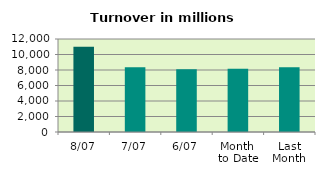
| Category | Series 0 |
|---|---|
| 8/07 | 11015.769 |
| 7/07 | 8370.104 |
| 6/07 | 8106.661 |
| Month 
to Date | 8154.6 |
| Last
Month | 8344.334 |